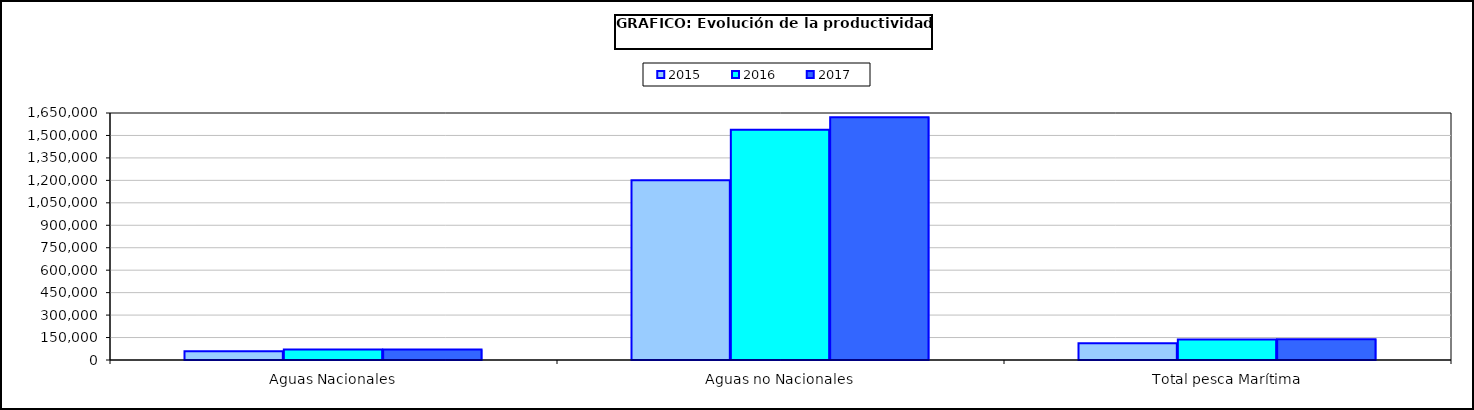
| Category | 2015 | 2016 | 2017 |
|---|---|---|---|
| 0 | 58558.794 | 69511.518 | 70669.255 |
| 1 | 1201114.948 | 1538868.762 | 1622080.15 |
| 2 | 112588.623 | 136700.226 | 139309.134 |